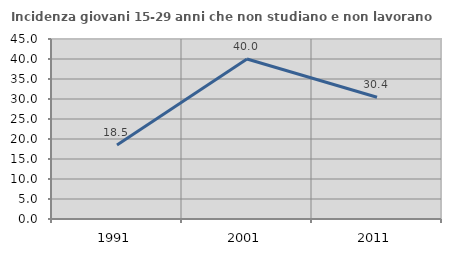
| Category | Incidenza giovani 15-29 anni che non studiano e non lavorano  |
|---|---|
| 1991.0 | 18.508 |
| 2001.0 | 40 |
| 2011.0 | 30.435 |